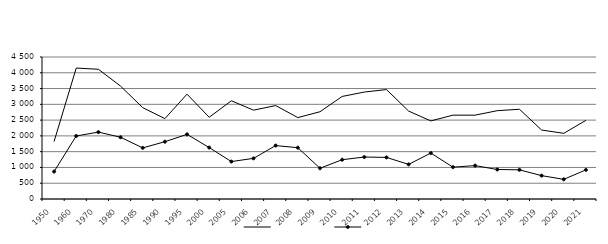
| Category | Series 1 | Series 3 |
|---|---|---|
| 1950.0 | 1822.558 | 870.292 |
| 1960.0 | 4150.159 | 1996.889 |
| 1970.0 | 4110.957 | 2120.244 |
| 1980.0 | 3577.067 | 1956.616 |
| 1985.0 | 2894.777 | 1619.272 |
| 1990.0 | 2547.432 | 1815.279 |
| 1995.0 | 3322.71 | 2047.987 |
| 2000.0 | 2590.289 | 1629.856 |
| 2005.0 | 3112.894 | 1186.048 |
| 2006.0 | 2815.379 | 1287.784 |
| 2007.0 | 2960.728 | 1693.348 |
| 2008.0 | 2580 | 1626.071 |
| 2009.0 | 2765 | 974 |
| 2010.0 | 3250 | 1245 |
| 2011.0 | 3389 | 1330 |
| 2012.0 | 3468 | 1318 |
| 2013.0 | 2786 | 1097 |
| 2014.0 | 2474 | 1456 |
| 2015.0 | 2657 | 1009 |
| 2016.0 | 2657 | 1058 |
| 2017.0 | 2799 | 935 |
| 2018.0 | 2844 | 924 |
| 2019.0 | 2186 | 740 |
| 2020.0 | 2081 | 623 |
| 2021.0 | 2493 | 923 |